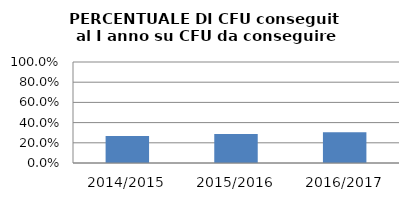
| Category | 2014/2015 2015/2016 2016/2017 |
|---|---|
| 2014/2015 | 0.267 |
| 2015/2016 | 0.287 |
| 2016/2017 | 0.304 |